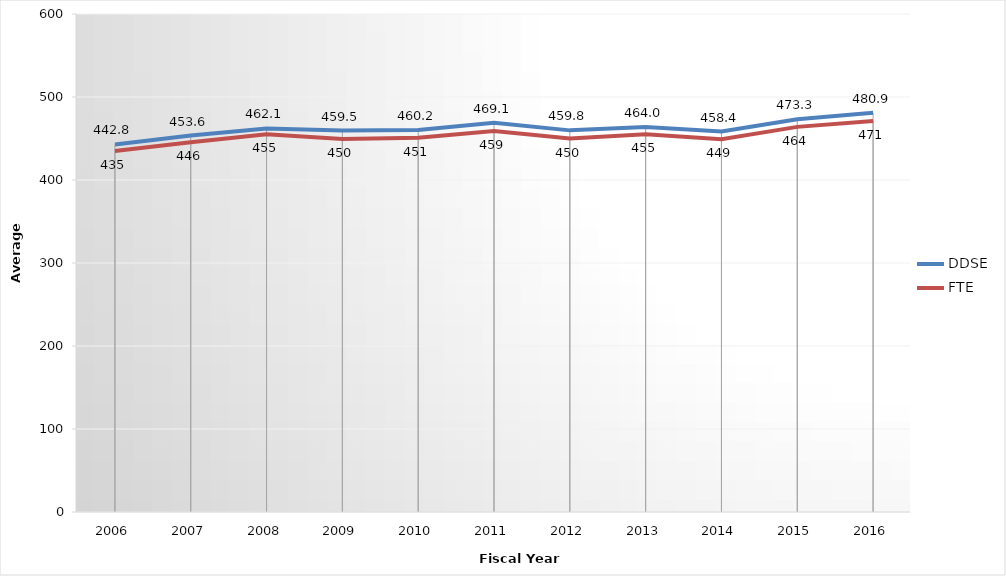
| Category | DDSE | FTE |
|---|---|---|
| 2006.0 | 442.8 | 435 |
| 2007.0 | 453.6 | 445.6 |
| 2008.0 | 462.1 | 455 |
| 2009.0 | 459.5 | 449.5 |
| 2010.0 | 460.2 | 451 |
| 2011.0 | 469.1 | 459 |
| 2012.0 | 459.8 | 450 |
| 2013.0 | 464 | 455 |
| 2014.0 | 458.4 | 449 |
| 2015.0 | 473.3 | 464 |
| 2016.0 | 480.9 | 471 |